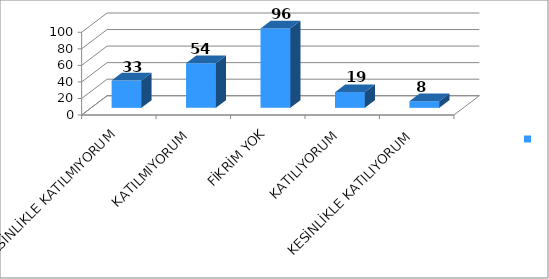
| Category | Series 0 |
|---|---|
| KESİNLİKLE KATILMIYORUM | 33 |
| KATILMIYORUM | 54 |
| FİKRİM YOK | 96 |
| KATILIYORUM | 19 |
| KESİNLİKLE KATILIYORUM | 8 |